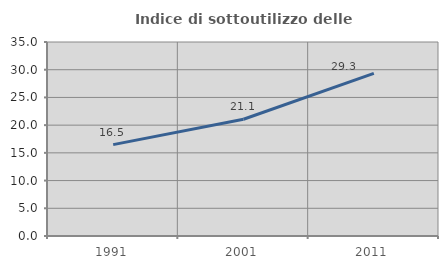
| Category | Indice di sottoutilizzo delle abitazioni  |
|---|---|
| 1991.0 | 16.49 |
| 2001.0 | 21.066 |
| 2011.0 | 29.329 |